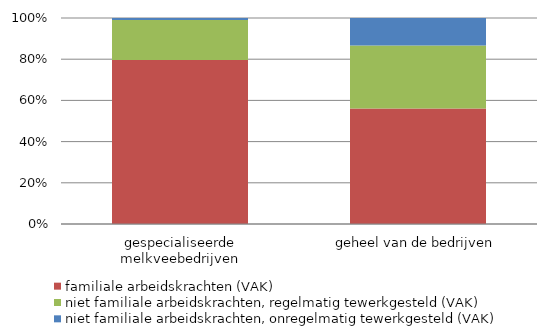
| Category | familiale arbeidskrachten (VAK) | niet familiale arbeidskrachten, regelmatig tewerkgesteld (VAK) | niet familiale arbeidskrachten, onregelmatig tewerkgesteld (VAK) |
|---|---|---|---|
| gespecialiseerde melkveebedrijven | 3841.63 | 936.75 | 45.65 |
| geheel van de bedrijven | 22042.63 | 12010.25 | 5262.07 |